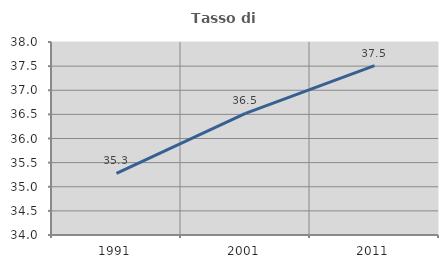
| Category | Tasso di occupazione   |
|---|---|
| 1991.0 | 35.275 |
| 2001.0 | 36.519 |
| 2011.0 | 37.512 |